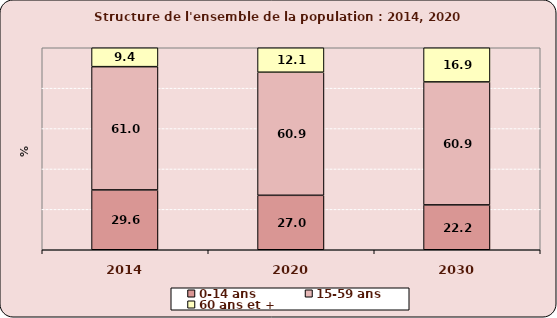
| Category | 0-14 ans  | 15-59 ans | 60 ans et + |
|---|---|---|---|
| 2014.0 | 29.612 | 61.033 | 9.355 |
| 2020.0 | 26.955 | 60.931 | 12.114 |
| 2030.0 | 22.197 | 60.888 | 16.916 |